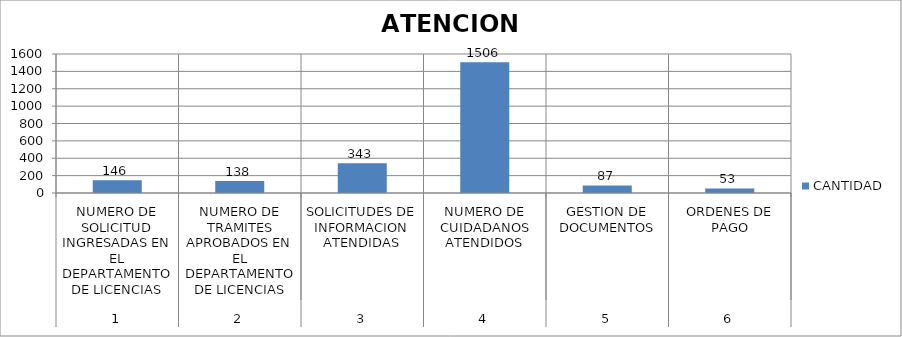
| Category | CANTIDAD |
|---|---|
| 0 | 146 |
| 1 | 138 |
| 2 | 343 |
| 3 | 1506 |
| 4 | 87 |
| 5 | 53 |